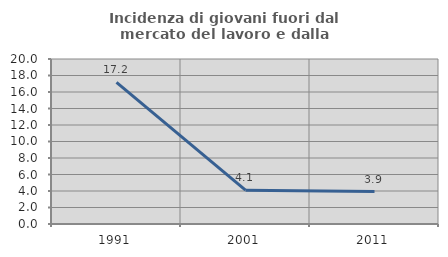
| Category | Incidenza di giovani fuori dal mercato del lavoro e dalla formazione  |
|---|---|
| 1991.0 | 17.16 |
| 2001.0 | 4.098 |
| 2011.0 | 3.937 |